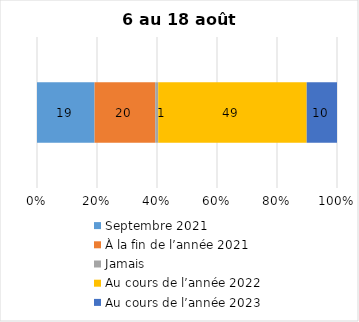
| Category | Septembre 2021 | À la fin de l’année 2021 | Jamais | Au cours de l’année 2022 | Au cours de l’année 2023 |
|---|---|---|---|---|---|
| 0 | 19 | 20 | 1 | 49 | 10 |